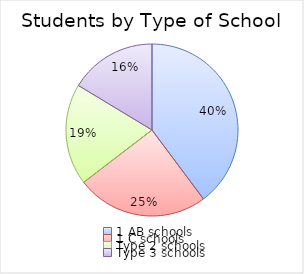
| Category | Series 0 |
|---|---|
| 1 AB schools | 1657886 |
| 1 C schools | 1033277 |
| Type 2 schools | 793966 |
| Type 3 schools | 680826 |